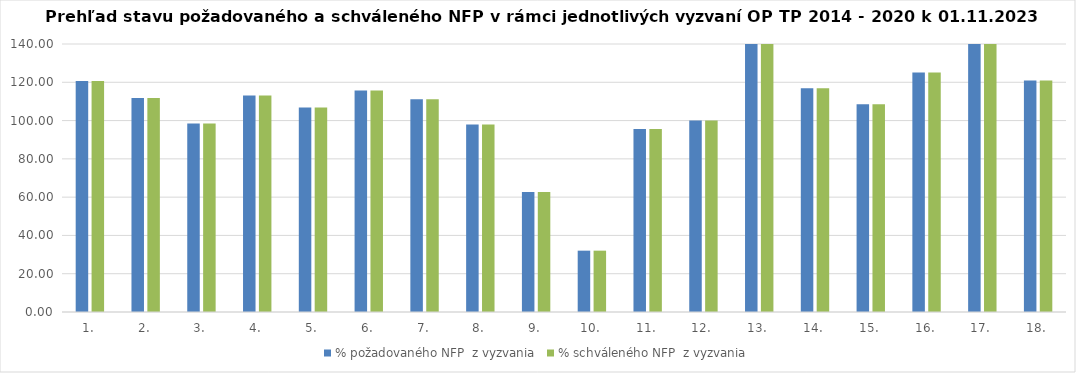
| Category | % požadovaného NFP  z vyzvania | % schváleného NFP  z vyzvania |
|---|---|---|
| 1. | 120.673 | 120.673 |
| 2. | 111.84 | 111.84 |
| 3. | 98.474 | 98.474 |
| 4. | 113.162 | 113.162 |
| 5. | 106.767 | 106.767 |
| 6. | 115.745 | 115.745 |
| 7. | 111.089 | 111.089 |
| 8. | 97.998 | 97.998 |
| 9. | 62.727 | 62.727 |
| 10. | 32.041 | 32.041 |
| 11. | 95.621 | 95.621 |
| 12. | 100.009 | 100.009 |
| 13. | 151.956 | 151.956 |
| 14. | 116.9 | 116.9 |
| 15. | 108.564 | 108.564 |
| 16. | 125.057 | 125.057 |
| 17. | 171.931 | 171.931 |
| 18. | 120.879 | 120.879 |